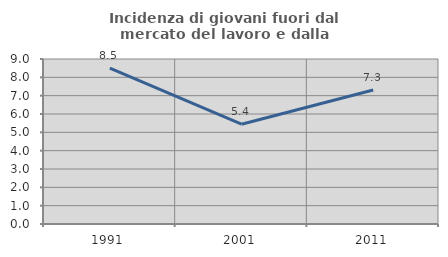
| Category | Incidenza di giovani fuori dal mercato del lavoro e dalla formazione  |
|---|---|
| 1991.0 | 8.507 |
| 2001.0 | 5.444 |
| 2011.0 | 7.311 |